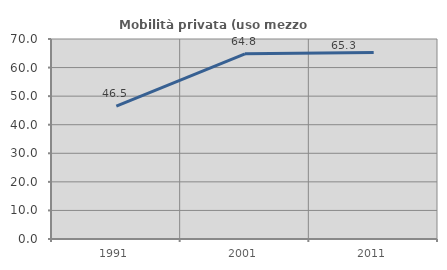
| Category | Mobilità privata (uso mezzo privato) |
|---|---|
| 1991.0 | 46.506 |
| 2001.0 | 64.804 |
| 2011.0 | 65.292 |